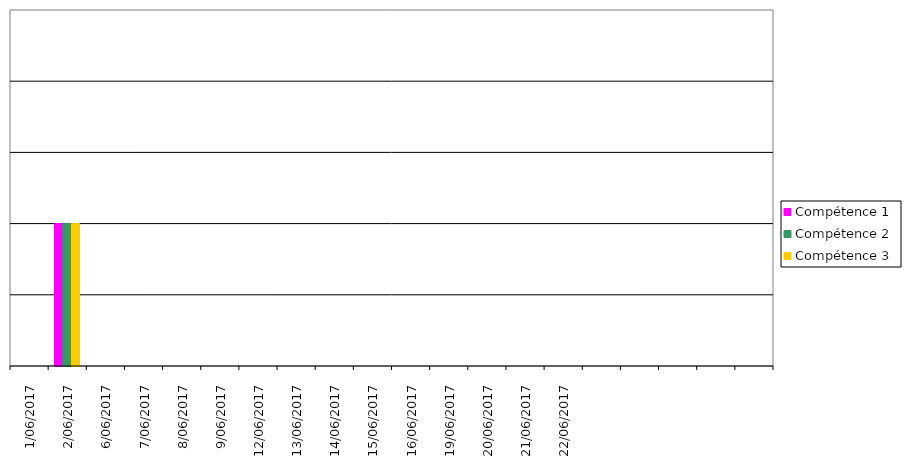
| Category | Compétence 1 | Compétence 2 | Compétence 3 |
|---|---|---|---|
| 1/06/2017 | 0 | 0 | 0 |
| 2/06/2017 | 2 | 2 | 2 |
| 6/06/2017 | 0 | 0 | 0 |
| 7/06/2017 | 0 | 0 | 0 |
| 8/06/2017 | 0 | 0 | 0 |
| 9/06/2017 | 0 | 0 | 0 |
| 12/06/2017 | 0 | 0 | 0 |
| 13/06/2017 | 0 | 0 | 0 |
| 14/06/2017 | 0 | 0 | 0 |
| 15/06/2017 | 0 | 0 | 0 |
| 16/06/2017 | 0 | 0 | 0 |
| 19/06/2017 | 0 | 0 | 0 |
| 20/06/2017 | 0 | 0 | 0 |
| 21/06/2017 | 0 | 0 | 0 |
| 22/06/2017 | 0 | 0 | 0 |